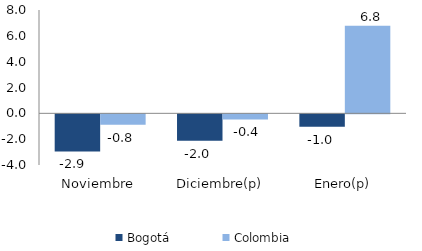
| Category | Bogotá | Colombia |
|---|---|---|
| Noviembre | -2.872 | -0.812 |
| Diciembre(p) | -2.042 | -0.391 |
| Enero(p) | -0.966 | 6.776 |